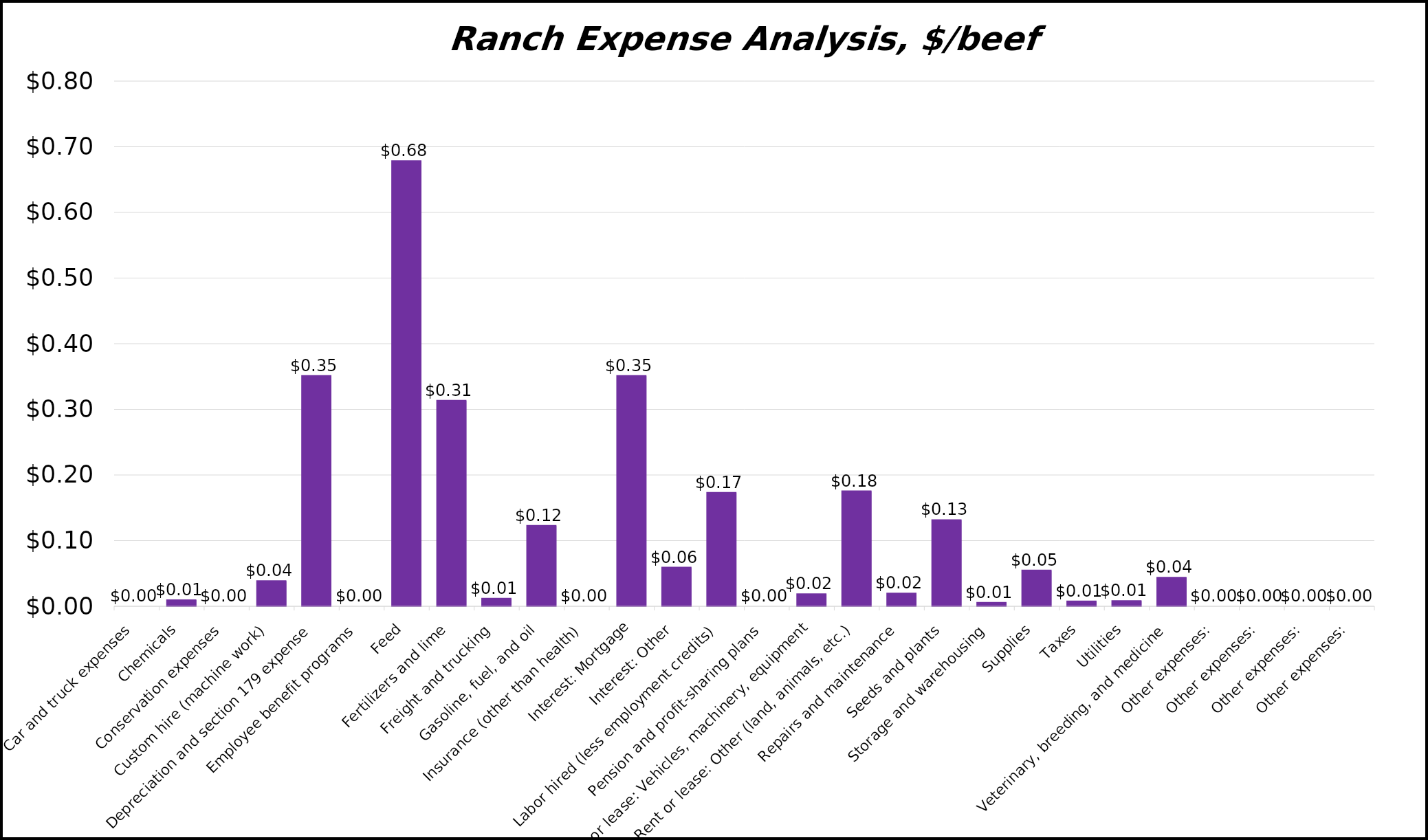
| Category | $/beef cow |
|---|---|
| Car and truck expenses | 0 |
| Chemicals | 0.01 |
| Conservation expenses | 0 |
| Custom hire (machine work) | 0.038 |
| Depreciation and section 179 expense | 0.351 |
| Employee benefit programs | 0 |
| Feed | 0.678 |
| Fertilizers and lime | 0.313 |
| Freight and trucking | 0.012 |
| Gasoline, fuel, and oil | 0.123 |
| Insurance (other than health) | 0 |
| Interest: Mortgage | 0.351 |
| Interest: Other | 0.059 |
| Labor hired (less employment credits) | 0.173 |
| Pension and profit-sharing plans | 0 |
| Rent or lease: Vehicles, machinery, equipment | 0.019 |
| Rent or lease: Other (land, animals, etc.) | 0.175 |
| Repairs and maintenance | 0.02 |
| Seeds and plants | 0.132 |
| Storage and warehousing | 0.005 |
| Supplies | 0.055 |
| Taxes | 0.008 |
| Utilities | 0.008 |
| Veterinary, breeding, and medicine | 0.044 |
| Other expenses: | 0 |
| Other expenses: | 0 |
| Other expenses: | 0 |
| Other expenses: | 0 |